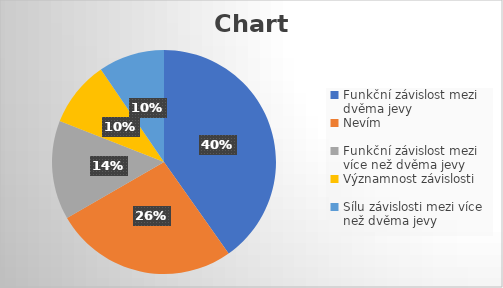
| Category | Series 0 |
|---|---|
| Funkční závislost mezi dvěma jevy | 76 |
| Nevím | 50 |
| Funkční závislost mezi více než dvěma jevy | 27 |
| Významnost závislosti | 18 |
| Sílu závislosti mezi více než dvěma jevy | 18 |